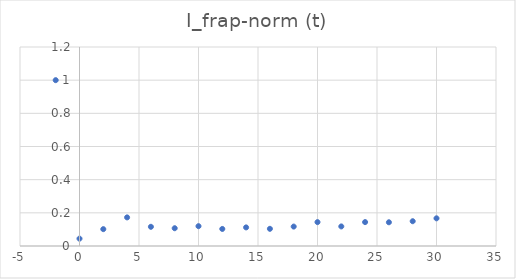
| Category | I_frap-norm (t) |
|---|---|
| -2.0 | 1 |
| 0.0 | 0.044 |
| 2.0 | 0.102 |
| 4.0 | 0.173 |
| 6.0 | 0.116 |
| 8.0 | 0.107 |
| 10.0 | 0.12 |
| 12.0 | 0.103 |
| 14.0 | 0.112 |
| 16.0 | 0.104 |
| 18.0 | 0.117 |
| 20.0 | 0.144 |
| 22.0 | 0.118 |
| 24.0 | 0.144 |
| 26.0 | 0.143 |
| 28.0 | 0.149 |
| 30.0 | 0.167 |